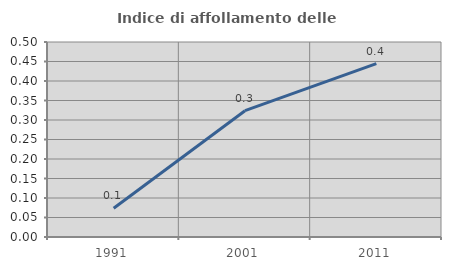
| Category | Indice di affollamento delle abitazioni  |
|---|---|
| 1991.0 | 0.074 |
| 2001.0 | 0.324 |
| 2011.0 | 0.445 |